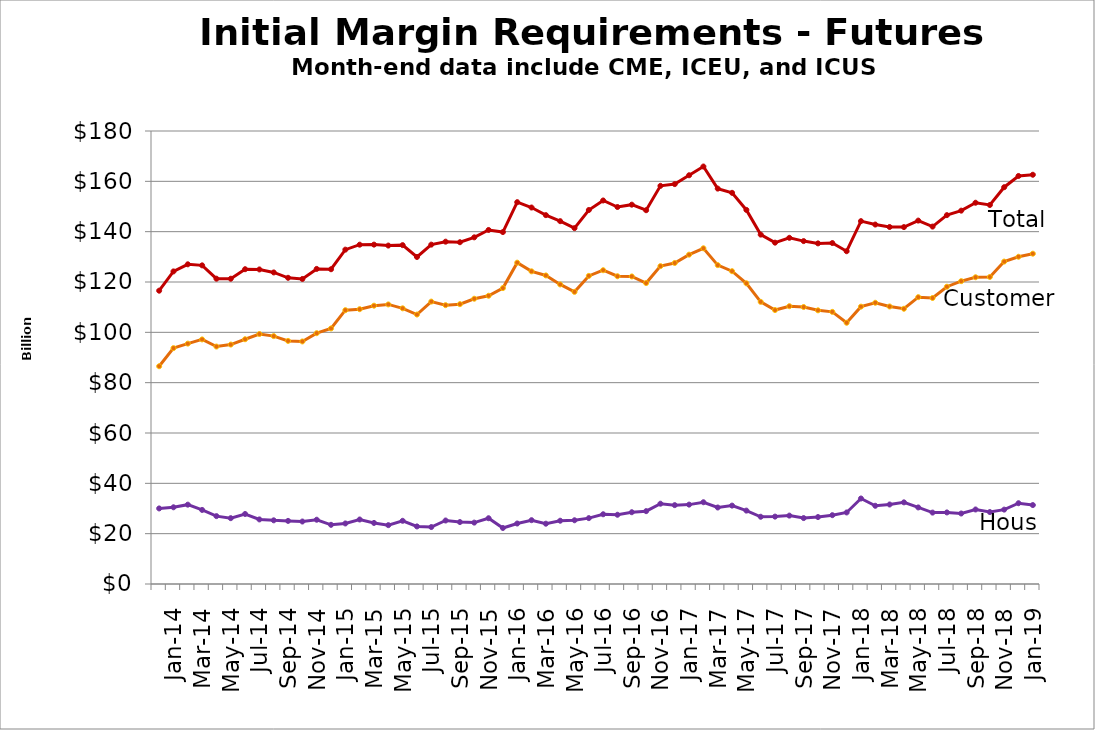
| Category | Customer | House | Total |
|---|---|---|---|
|   |  |  |  |
| Jan-14 |  |  |  |
|   |  |  |  |
| Mar-14 |  |  |  |
|   |  |  |  |
| May-14 |  |  |  |
|   |  |  |  |
| Jul-14 |  |  |  |
|   |  |  |  |
| Sep-14 |  |  |  |
|   |  |  |  |
| Nov-14 |  |  |  |
|   |  |  |  |
| Jan-15 |  |  |  |
|   |  |  |  |
| Mar-15 |  |  |  |
|   |  |  |  |
| May-15 |  |  |  |
|   |  |  |  |
| Jul-15 |  |  |  |
|   |  |  |  |
| Sep-15 |  |  |  |
|   |  |  |  |
| Nov-15 |  |  |  |
|   |  |  |  |
| Jan-16 |  |  |  |
|   |  |  |  |
| Mar-16 |  |  |  |
|   |  |  |  |
| May-16 |  |  |  |
|   |  |  |  |
| Jul-16 |  |  |  |
|   |  |  |  |
| Sep-16 |  |  |  |
|   |  |  |  |
| Nov-16 |  |  |  |
|   |  |  |  |
| Jan-17 |  |  |  |
|   |  |  |  |
| Mar-17 |  |  |  |
|   |  |  |  |
| May-17 |  |  |  |
|   |  |  |  |
| Jul-17 |  |  |  |
|   |  |  |  |
| Sep-17 |  |  |  |
|   |  |  |  |
| Nov-17 |  |  |  |
|   |  |  |  |
| Jan-18 |  |  |  |
|   |  |  |  |
| Mar-18 |  |  |  |
|   |  |  |  |
| May-18 |  |  |  |
|   |  |  |  |
| Jul-18 |  |  |  |
|   |  |  |  |
| Sep-18 |  |  |  |
|   |  |  |  |
| Nov-18 |  |  |  |
|   |  |  |  |
| Jan-19 |  |  |  |